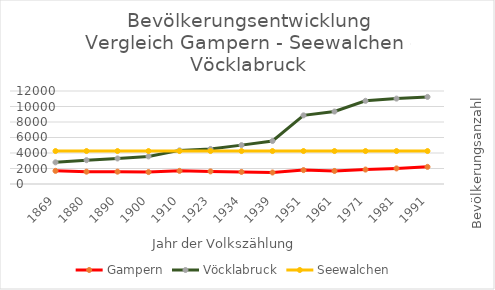
| Category | Gampern | Vöcklabruck | Seewalchen |
|---|---|---|---|
| 1991 | 2212 | 11239 | 4253 |
| 1981 | 2010 | 11019 | 4253 |
| 1971 | 1862 | 10732 | 4253 |
| 1961 | 1683 | 9353 | 4253 |
| 1951 | 1794 | 8857 | 4253 |
| 1939 | 1483 | 5546 | 4253 |
| 1934 | 1558 | 5017 | 4253 |
| 1923 | 1629 | 4520 | 4253 |
| 1910 | 1694 | 4338 | 4253 |
| 1900 | 1540 | 3562 | 4253 |
| 1890 | 1593 | 3294 | 4253 |
| 1880 | 1593 | 3076 | 4253 |
| 1869 | 1695 | 2794 | 4253 |